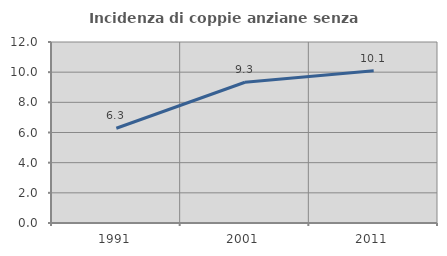
| Category | Incidenza di coppie anziane senza figli  |
|---|---|
| 1991.0 | 6.283 |
| 2001.0 | 9.333 |
| 2011.0 | 10.086 |